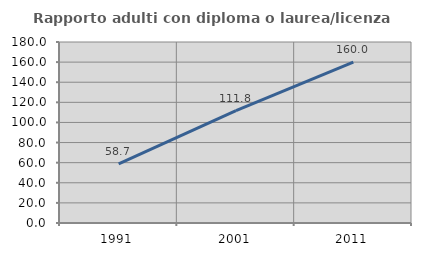
| Category | Rapporto adulti con diploma o laurea/licenza media  |
|---|---|
| 1991.0 | 58.69 |
| 2001.0 | 111.776 |
| 2011.0 | 159.964 |